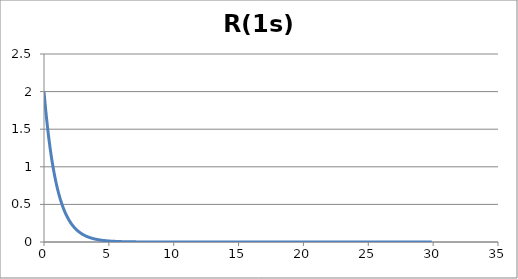
| Category | R(1s) |
|---|---|
| 0.0 | 2 |
| 0.1 | 1.81 |
| 0.2 | 1.637 |
| 0.30000000000000004 | 1.482 |
| 0.4 | 1.341 |
| 0.5 | 1.213 |
| 0.6 | 1.098 |
| 0.7 | 0.993 |
| 0.7999999999999999 | 0.899 |
| 0.8999999999999999 | 0.813 |
| 0.9999999999999999 | 0.736 |
| 1.0999999999999999 | 0.666 |
| 1.2 | 0.602 |
| 1.3 | 0.545 |
| 1.4000000000000001 | 0.493 |
| 1.5000000000000002 | 0.446 |
| 1.6000000000000003 | 0.404 |
| 1.7000000000000004 | 0.365 |
| 1.8000000000000005 | 0.331 |
| 1.9000000000000006 | 0.299 |
| 2.0000000000000004 | 0.271 |
| 2.1000000000000005 | 0.245 |
| 2.2000000000000006 | 0.222 |
| 2.3000000000000007 | 0.201 |
| 2.400000000000001 | 0.181 |
| 2.500000000000001 | 0.164 |
| 2.600000000000001 | 0.149 |
| 2.700000000000001 | 0.134 |
| 2.800000000000001 | 0.122 |
| 2.9000000000000012 | 0.11 |
| 3.0000000000000013 | 0.1 |
| 3.1000000000000014 | 0.09 |
| 3.2000000000000015 | 0.082 |
| 3.3000000000000016 | 0.074 |
| 3.4000000000000017 | 0.067 |
| 3.5000000000000018 | 0.06 |
| 3.600000000000002 | 0.055 |
| 3.700000000000002 | 0.049 |
| 3.800000000000002 | 0.045 |
| 3.900000000000002 | 0.04 |
| 4.000000000000002 | 0.037 |
| 4.100000000000001 | 0.033 |
| 4.200000000000001 | 0.03 |
| 4.300000000000001 | 0.027 |
| 4.4 | 0.025 |
| 4.5 | 0.022 |
| 4.6 | 0.02 |
| 4.699999999999999 | 0.018 |
| 4.799999999999999 | 0.016 |
| 4.899999999999999 | 0.015 |
| 4.999999999999998 | 0.013 |
| 5.099999999999998 | 0.012 |
| 5.1999999999999975 | 0.011 |
| 5.299999999999997 | 0.01 |
| 5.399999999999997 | 0.009 |
| 5.4999999999999964 | 0.008 |
| 5.599999999999996 | 0.007 |
| 5.699999999999996 | 0.007 |
| 5.799999999999995 | 0.006 |
| 5.899999999999995 | 0.005 |
| 5.999999999999995 | 0.005 |
| 6.099999999999994 | 0.004 |
| 6.199999999999994 | 0.004 |
| 6.299999999999994 | 0.004 |
| 6.399999999999993 | 0.003 |
| 6.499999999999993 | 0.003 |
| 6.5999999999999925 | 0.003 |
| 6.699999999999992 | 0.002 |
| 6.799999999999992 | 0.002 |
| 6.8999999999999915 | 0.002 |
| 6.999999999999991 | 0.002 |
| 7.099999999999991 | 0.002 |
| 7.19999999999999 | 0.001 |
| 7.29999999999999 | 0.001 |
| 7.39999999999999 | 0.001 |
| 7.499999999999989 | 0.001 |
| 7.599999999999989 | 0.001 |
| 7.699999999999989 | 0.001 |
| 7.799999999999988 | 0.001 |
| 7.899999999999988 | 0.001 |
| 7.999999999999988 | 0.001 |
| 8.099999999999987 | 0.001 |
| 8.199999999999987 | 0.001 |
| 8.299999999999986 | 0 |
| 8.399999999999986 | 0 |
| 8.499999999999986 | 0 |
| 8.599999999999985 | 0 |
| 8.699999999999985 | 0 |
| 8.799999999999985 | 0 |
| 8.899999999999984 | 0 |
| 8.999999999999984 | 0 |
| 9.099999999999984 | 0 |
| 9.199999999999983 | 0 |
| 9.299999999999983 | 0 |
| 9.399999999999983 | 0 |
| 9.499999999999982 | 0 |
| 9.599999999999982 | 0 |
| 9.699999999999982 | 0 |
| 9.799999999999981 | 0 |
| 9.89999999999998 | 0 |
| 9.99999999999998 | 0 |
| 10.09999999999998 | 0 |
| 10.19999999999998 | 0 |
| 10.29999999999998 | 0 |
| 10.399999999999979 | 0 |
| 10.499999999999979 | 0 |
| 10.599999999999978 | 0 |
| 10.699999999999978 | 0 |
| 10.799999999999978 | 0 |
| 10.899999999999977 | 0 |
| 10.999999999999977 | 0 |
| 11.099999999999977 | 0 |
| 11.199999999999976 | 0 |
| 11.299999999999976 | 0 |
| 11.399999999999975 | 0 |
| 11.499999999999975 | 0 |
| 11.599999999999975 | 0 |
| 11.699999999999974 | 0 |
| 11.799999999999974 | 0 |
| 11.899999999999974 | 0 |
| 11.999999999999973 | 0 |
| 12.099999999999973 | 0 |
| 12.199999999999973 | 0 |
| 12.299999999999972 | 0 |
| 12.399999999999972 | 0 |
| 12.499999999999972 | 0 |
| 12.599999999999971 | 0 |
| 12.69999999999997 | 0 |
| 12.79999999999997 | 0 |
| 12.89999999999997 | 0 |
| 12.99999999999997 | 0 |
| 13.09999999999997 | 0 |
| 13.199999999999969 | 0 |
| 13.299999999999969 | 0 |
| 13.399999999999968 | 0 |
| 13.499999999999968 | 0 |
| 13.599999999999968 | 0 |
| 13.699999999999967 | 0 |
| 13.799999999999967 | 0 |
| 13.899999999999967 | 0 |
| 13.999999999999966 | 0 |
| 14.099999999999966 | 0 |
| 14.199999999999966 | 0 |
| 14.299999999999965 | 0 |
| 14.399999999999965 | 0 |
| 14.499999999999964 | 0 |
| 14.599999999999964 | 0 |
| 14.699999999999964 | 0 |
| 14.799999999999963 | 0 |
| 14.899999999999963 | 0 |
| 14.999999999999963 | 0 |
| 15.099999999999962 | 0 |
| 15.199999999999962 | 0 |
| 15.299999999999962 | 0 |
| 15.399999999999961 | 0 |
| 15.499999999999961 | 0 |
| 15.59999999999996 | 0 |
| 15.69999999999996 | 0 |
| 15.79999999999996 | 0 |
| 15.89999999999996 | 0 |
| 15.99999999999996 | 0 |
| 16.09999999999996 | 0 |
| 16.19999999999996 | 0 |
| 16.29999999999996 | 0 |
| 16.399999999999963 | 0 |
| 16.499999999999964 | 0 |
| 16.599999999999966 | 0 |
| 16.699999999999967 | 0 |
| 16.79999999999997 | 0 |
| 16.89999999999997 | 0 |
| 16.99999999999997 | 0 |
| 17.099999999999973 | 0 |
| 17.199999999999974 | 0 |
| 17.299999999999976 | 0 |
| 17.399999999999977 | 0 |
| 17.49999999999998 | 0 |
| 17.59999999999998 | 0 |
| 17.69999999999998 | 0 |
| 17.799999999999983 | 0 |
| 17.899999999999984 | 0 |
| 17.999999999999986 | 0 |
| 18.099999999999987 | 0 |
| 18.19999999999999 | 0 |
| 18.29999999999999 | 0 |
| 18.39999999999999 | 0 |
| 18.499999999999993 | 0 |
| 18.599999999999994 | 0 |
| 18.699999999999996 | 0 |
| 18.799999999999997 | 0 |
| 18.9 | 0 |
| 19.0 | 0 |
| 19.1 | 0 |
| 19.200000000000003 | 0 |
| 19.300000000000004 | 0 |
| 19.400000000000006 | 0 |
| 19.500000000000007 | 0 |
| 19.60000000000001 | 0 |
| 19.70000000000001 | 0 |
| 19.80000000000001 | 0 |
| 19.900000000000013 | 0 |
| 20.000000000000014 | 0 |
| 20.100000000000016 | 0 |
| 20.200000000000017 | 0 |
| 20.30000000000002 | 0 |
| 20.40000000000002 | 0 |
| 20.50000000000002 | 0 |
| 20.600000000000023 | 0 |
| 20.700000000000024 | 0 |
| 20.800000000000026 | 0 |
| 20.900000000000027 | 0 |
| 21.00000000000003 | 0 |
| 21.10000000000003 | 0 |
| 21.20000000000003 | 0 |
| 21.300000000000033 | 0 |
| 21.400000000000034 | 0 |
| 21.500000000000036 | 0 |
| 21.600000000000037 | 0 |
| 21.70000000000004 | 0 |
| 21.80000000000004 | 0 |
| 21.90000000000004 | 0 |
| 22.000000000000043 | 0 |
| 22.100000000000044 | 0 |
| 22.200000000000045 | 0 |
| 22.300000000000047 | 0 |
| 22.40000000000005 | 0 |
| 22.50000000000005 | 0 |
| 22.60000000000005 | 0 |
| 22.700000000000053 | 0 |
| 22.800000000000054 | 0 |
| 22.900000000000055 | 0 |
| 23.000000000000057 | 0 |
| 23.10000000000006 | 0 |
| 23.20000000000006 | 0 |
| 23.30000000000006 | 0 |
| 23.400000000000063 | 0 |
| 23.500000000000064 | 0 |
| 23.600000000000065 | 0 |
| 23.700000000000067 | 0 |
| 23.800000000000068 | 0 |
| 23.90000000000007 | 0 |
| 24.00000000000007 | 0 |
| 24.100000000000072 | 0 |
| 24.200000000000074 | 0 |
| 24.300000000000075 | 0 |
| 24.400000000000077 | 0 |
| 24.500000000000078 | 0 |
| 24.60000000000008 | 0 |
| 24.70000000000008 | 0 |
| 24.800000000000082 | 0 |
| 24.900000000000084 | 0 |
| 25.000000000000085 | 0 |
| 25.100000000000087 | 0 |
| 25.200000000000088 | 0 |
| 25.30000000000009 | 0 |
| 25.40000000000009 | 0 |
| 25.500000000000092 | 0 |
| 25.600000000000094 | 0 |
| 25.700000000000095 | 0 |
| 25.800000000000097 | 0 |
| 25.900000000000098 | 0 |
| 26.0000000000001 | 0 |
| 26.1000000000001 | 0 |
| 26.200000000000102 | 0 |
| 26.300000000000104 | 0 |
| 26.400000000000105 | 0 |
| 26.500000000000107 | 0 |
| 26.600000000000108 | 0 |
| 26.70000000000011 | 0 |
| 26.80000000000011 | 0 |
| 26.900000000000112 | 0 |
| 27.000000000000114 | 0 |
| 27.100000000000115 | 0 |
| 27.200000000000117 | 0 |
| 27.300000000000118 | 0 |
| 27.40000000000012 | 0 |
| 27.50000000000012 | 0 |
| 27.600000000000122 | 0 |
| 27.700000000000124 | 0 |
| 27.800000000000125 | 0 |
| 27.900000000000126 | 0 |
| 28.000000000000128 | 0 |
| 28.10000000000013 | 0 |
| 28.20000000000013 | 0 |
| 28.300000000000132 | 0 |
| 28.400000000000134 | 0 |
| 28.500000000000135 | 0 |
| 28.600000000000136 | 0 |
| 28.700000000000138 | 0 |
| 28.80000000000014 | 0 |
| 28.90000000000014 | 0 |
| 29.000000000000142 | 0 |
| 29.100000000000144 | 0 |
| 29.200000000000145 | 0 |
| 29.300000000000146 | 0 |
| 29.400000000000148 | 0 |
| 29.50000000000015 | 0 |
| 29.60000000000015 | 0 |
| 29.700000000000152 | 0 |
| 29.800000000000153 | 0 |
| 29.900000000000155 | 0 |